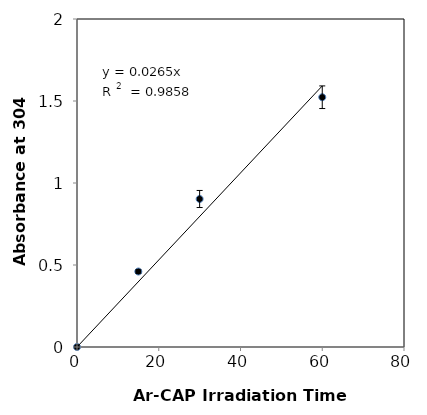
| Category | OD |
|---|---|
| 0.0 | 0 |
| 15.0 | 0.46 |
| 30.0 | 0.902 |
| 60.0 | 1.523 |